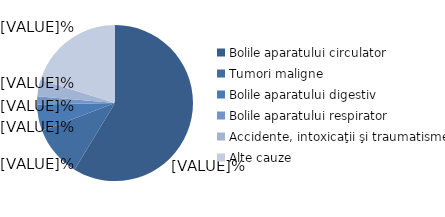
| Category | Femei |
|---|---|
| Bolile aparatului circulator | 58.7 |
| Tumori maligne | 10.5 |
| Bolile aparatului digestiv | 5.5 |
| Bolile aparatului respirator | 1.7 |
| Accidente, intoxicaţii şi traumatisme | 3.4 |
| Alte cauze  | 20.2 |